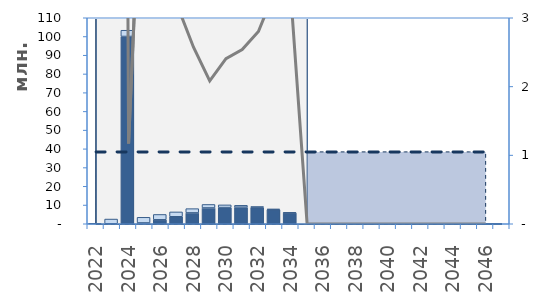
| Category | Погашение долга | Проценты |
|---|---|---|
| 2022.0 | 0 | 114 |
| 2023.0 | 0 | 2515 |
| 2024.0 | 100000 | 3336 |
| 2025.0 | 428.571 | 3020 |
| 2026.0 | 2114.121 | 2852 |
| 2027.0 | 3730.585 | 2587 |
| 2028.0 | 5794.272 | 2280 |
| 2029.0 | 8429.729 | 1875 |
| 2030.0 | 8633.47 | 1444 |
| 2031.0 | 8843.392 | 1006 |
| 2032.0 | 8631.112 | 572 |
| 2033.0 | 7568.251 | 285 |
| 2034.0 | 5826.496 | 65 |
| 2035.0 | 0 | 0 |
| 2036.0 | 0 | 0 |
| 2037.0 | 0 | 0 |
| 2038.0 | 0 | 0 |
| 2039.0 | 0 | 0 |
| 2040.0 | 0 | 0 |
| 2041.0 | 0 | 0 |
| 2042.0 | 0 | 0 |
| 2043.0 | 0 | 0 |
| 2044.0 | 0 | 0 |
| 2045.0 | 0 | 0 |
| 2046.0 | 0 | 0 |